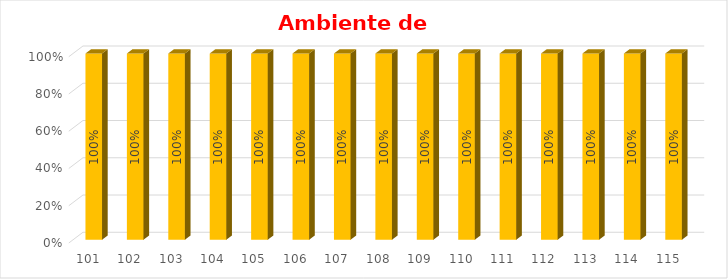
| Category | % Avance |
|---|---|
| 101.0 | 1 |
| 102.0 | 1 |
| 103.0 | 1 |
| 104.0 | 1 |
| 105.0 | 1 |
| 106.0 | 1 |
| 107.0 | 1 |
| 108.0 | 1 |
| 109.0 | 1 |
| 110.0 | 1 |
| 111.0 | 1 |
| 112.0 | 1 |
| 113.0 | 1 |
| 114.0 | 1 |
| 115.0 | 1 |